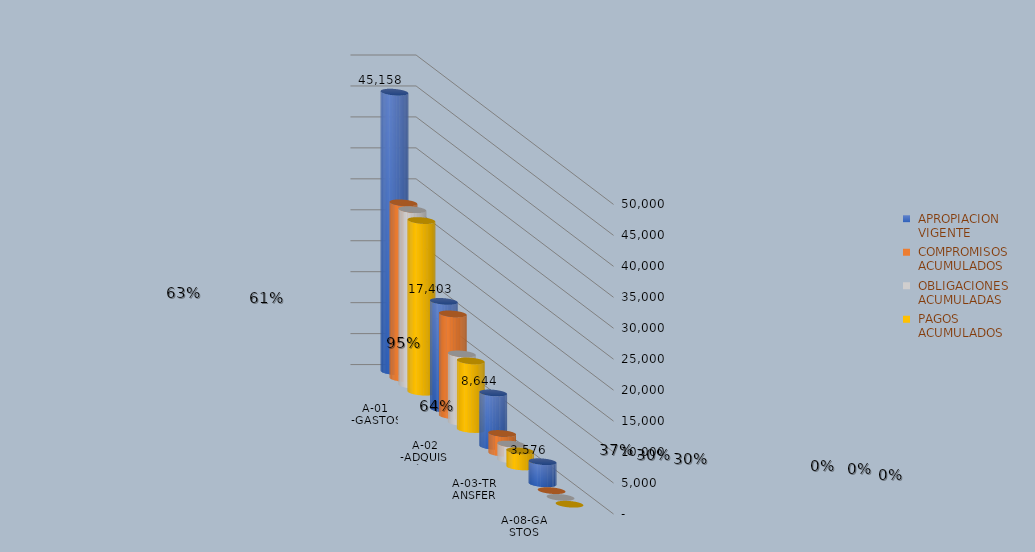
| Category |  APROPIACION
 VIGENTE |  COMPROMISOS
 ACUMULADOS |  OBLIGACIONES
 ACUMULADAS |  PAGOS
 ACUMULADOS |
|---|---|---|---|---|
| A-01 -GASTOS DE PERSONAL | 45158 | 28376.655 | 28376.655 | 27713.929 |
| A-02 -ADQUISICIÓN DE BIENES  Y SERVICIOS | 17402.665 | 16476.549 | 11107.417 | 11076.058 |
| A-03-TRANSFERENCIAS CORRIENTES | 8644 | 3196.566 | 2586.566 | 2586.566 |
| A-08-GASTOS POR TRIBUTOS, MULTAS, SANCIONES E INTERESES DE MORA | 3576 | 0 | 0 | 0 |